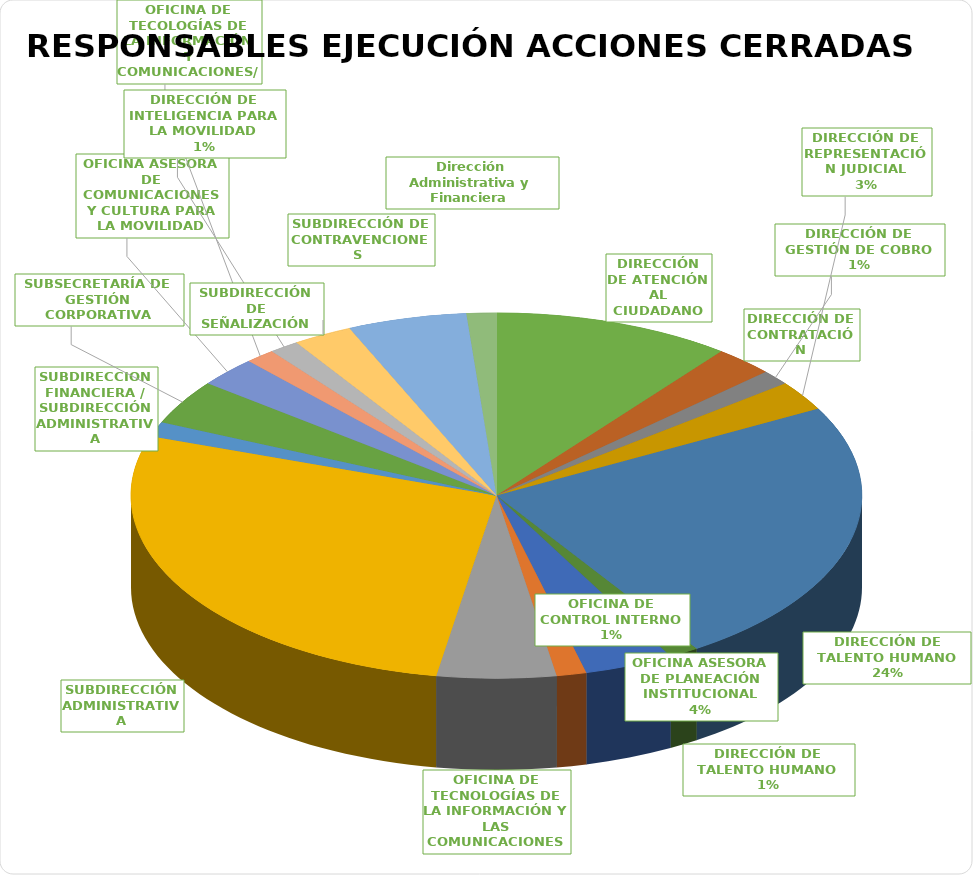
| Category | Total |
|---|---|
| DIRECCIÓN DE ATENCIÓN AL CIUDADANO | 8 |
| DIRECCIÓN DE CONTRATACIÓN | 2 |
| DIRECCIÓN DE GESTIÓN DE COBRO | 1 |
| DIRECCIÓN DE REPRESENTACIÓN JUDICIAL | 2 |
| DIRECCIÓN DE TALENTO HUMANO | 18 |
| DIRECCIÓN DE TALENTO HUMANO
DIRECCIÓN DE NORMATIVIDAD Y CONCEPTOS | 1 |
| OFICINA ASESORA DE PLANEACIÓN INSTITUCIONAL | 3 |
| OFICINA DE CONTROL INTERNO | 1 |
| OFICINA DE TECNOLOGÍAS DE LA INFORMACIÓN Y LAS COMUNICACIONES | 4 |
| SUBDIRECCIÓN ADMINISTRATIVA | 21 |
| SUBDIRECCION FINANCIERA / SUBDIRECCIÓN ADMINISTRATIVA | 1 |
| SUBSECRETARÍA DE GESTIÓN CORPORATIVA | 3 |
| OFICINA ASESORA DE COMUNICACIONES Y CULTURA PARA LA MOVILIDAD | 2 |
| OFICINA DE TECOLOGÍAS DE LA INFORMACIÓN Y COMUNICACIONES/
OFICINA ASESORA DE COMUNICACIONES Y CULTURA PARA LA MOVILIDAD | 1 |
| DIRECCIÓN DE INTELIGENCIA PARA LA MOVILIDAD
SUBDIRECCIÓN DE CONTROL DE TRÁNSITO Y TRANSPORTE
SUBDIRECCIÓN DE INFRAESTRUCTURA
DIRECCIÓN DE ATENCIÓN AL CIUDADANO
SUBDIRECCIÓN DE CONTRAVENCIONES
DIRECCIÓN DE GESTIÓN DE COBRO
DIRECCIÓN DE INVESTIGACIONES ADMIN | 1 |
| SUBDIRECCIÓN DE SEÑALIZACIÓN | 2 |
| SUBDIRECCIÓN DE CONTRAVENCIONES  | 4 |
| Dirección Administrativa y Financiera  | 1 |